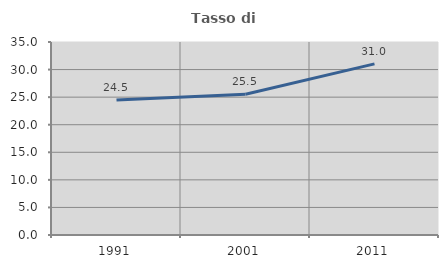
| Category | Tasso di occupazione   |
|---|---|
| 1991.0 | 24.501 |
| 2001.0 | 25.526 |
| 2011.0 | 31.027 |